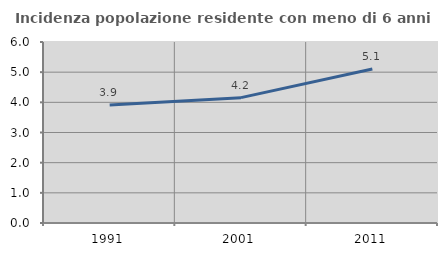
| Category | Incidenza popolazione residente con meno di 6 anni |
|---|---|
| 1991.0 | 3.912 |
| 2001.0 | 4.155 |
| 2011.0 | 5.105 |